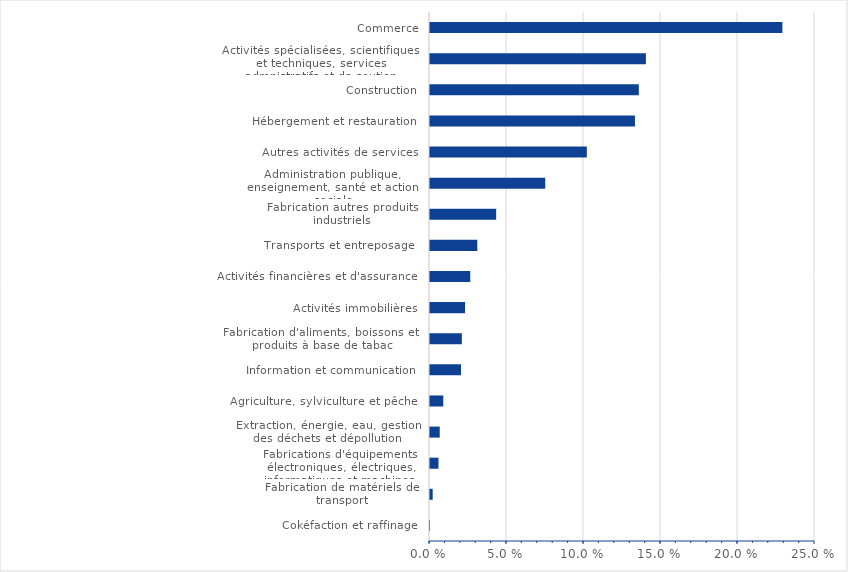
| Category | Series 0 |
|---|---|
| Cokéfaction et raffinage | 0 |
| Fabrication de matériels de transport | 0.002 |
| Fabrications d'équipements électroniques, électriques, informatiques et machines  | 0.005 |
| Extraction, énergie, eau, gestion des déchets et dépollution | 0.006 |
| Agriculture, sylviculture et pêche | 0.009 |
| Information et communication | 0.02 |
| Fabrication d'aliments, boissons et produits à base de tabac | 0.021 |
| Activités immobilières | 0.023 |
| Activités financières et d'assurance | 0.026 |
| Transports et entreposage  | 0.031 |
| Fabrication autres produits industriels  | 0.043 |
| Administration publique, enseignement, santé et action sociale | 0.075 |
| Autres activités de services | 0.102 |
| Hébergement et restauration | 0.133 |
| Construction | 0.136 |
| Activités spécialisées, scientifiques et techniques, services admnistratifs et de soutien | 0.14 |
| Commerce | 0.229 |